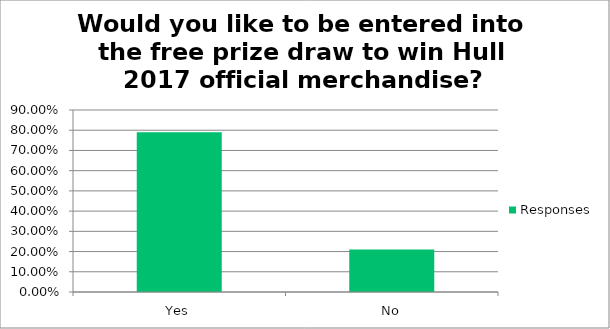
| Category | Responses |
|---|---|
| Yes | 0.79 |
| No | 0.21 |